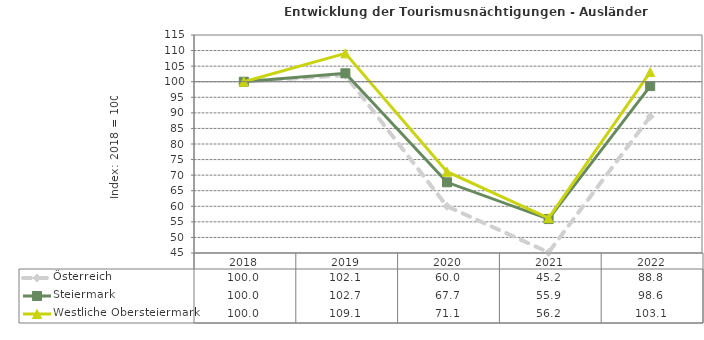
| Category | Österreich | Steiermark | Westliche Obersteiermark |
|---|---|---|---|
| 2022.0 | 88.8 | 98.6 | 103.1 |
| 2021.0 | 45.2 | 55.9 | 56.2 |
| 2020.0 | 60 | 67.7 | 71.1 |
| 2019.0 | 102.1 | 102.7 | 109.1 |
| 2018.0 | 100 | 100 | 100 |